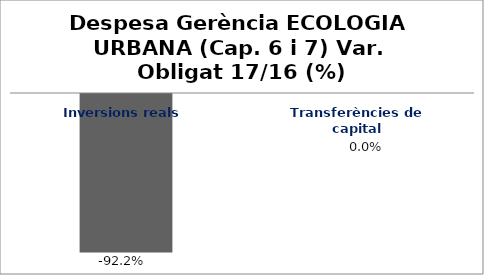
| Category | Series 0 |
|---|---|
| Inversions reals | -0.922 |
| Transferències de capital | 0 |